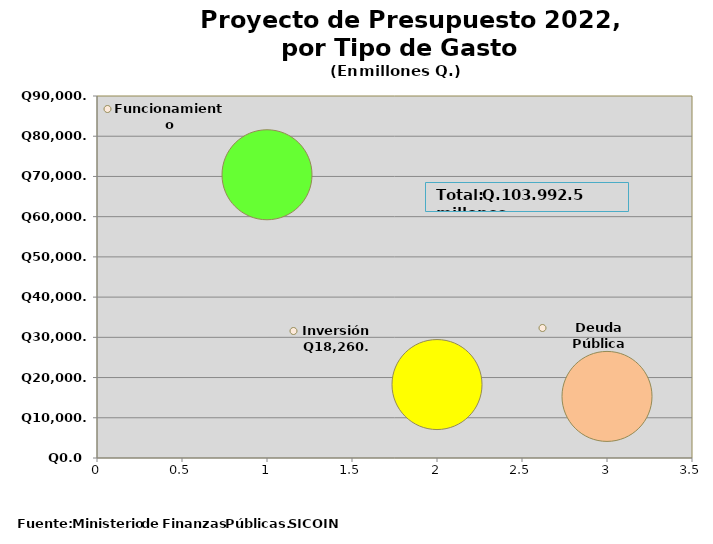
| Category | Recomendado 2022 |
|---|---|
| 0 | 70420 |
| 1 | 18260.5 |
| 2 | 15312 |